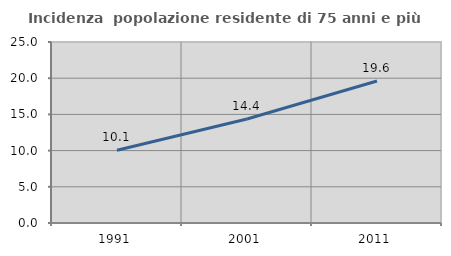
| Category | Incidenza  popolazione residente di 75 anni e più |
|---|---|
| 1991.0 | 10.05 |
| 2001.0 | 14.362 |
| 2011.0 | 19.608 |